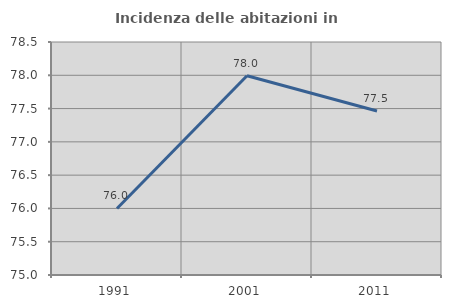
| Category | Incidenza delle abitazioni in proprietà  |
|---|---|
| 1991.0 | 76 |
| 2001.0 | 77.993 |
| 2011.0 | 77.464 |